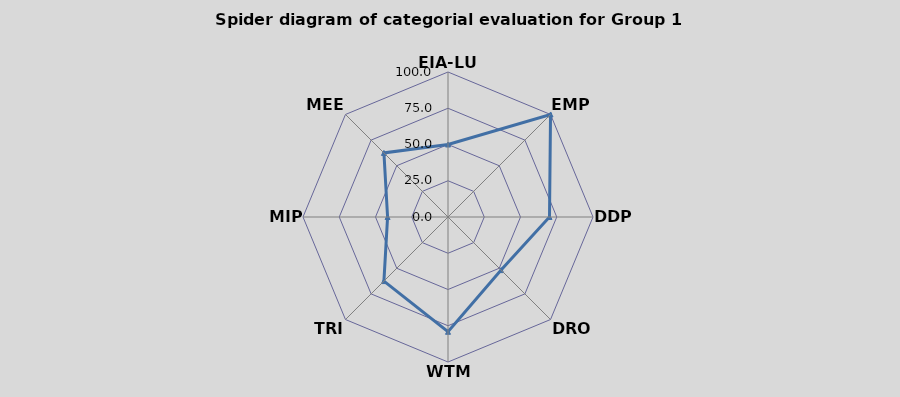
| Category | B1 |
|---|---|
| EIA-LUP | 50 |
| EMP | 100 |
| DDP | 70 |
| DRO | 51.786 |
| WTM | 79.167 |
| TRI | 62.5 |
| MIP | 41.667 |
| MEE | 62.5 |